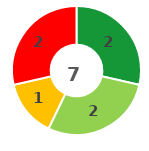
| Category | Series 0 |
|---|---|
| 0 | 2 |
| 1 | 2 |
| 2 | 1 |
| 3 | 2 |
| 4 | 0 |